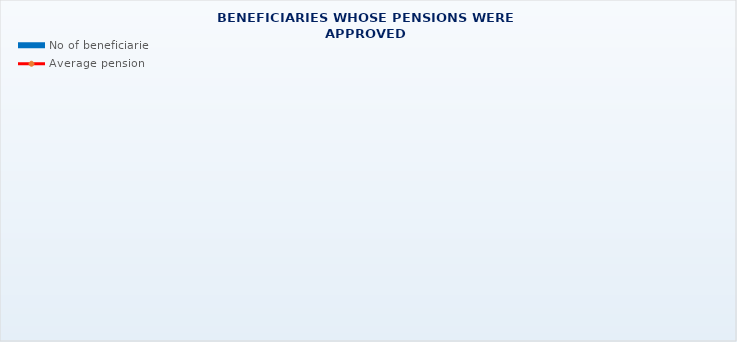
| Category | No of beneficiaries |
|---|---|
| Authorised officials in internal affairs, judicial officers and workers engaged in demining work: | 17264 |
| Pension beneficiaries entitled under the Fire Services Act (Official Gazette 125/19)* | 48 |
| Active military personnel - DVO  | 15819 |
| Croatian Homeland Army veterans mobilised from 1941 to 1945 | 3576 |
| Former political prisoners | 2687 |
| Croatian Veterans from the Homeland War - ZOHBDR (Act on Croatian Homeland War Veterans and Their Family Members) | 71127 |
| Pensions approved under general regulations and determined according to the Act on the Rights of Croatian Homeland War Veterans and their Family Members (ZOHBDR), in 2017 (Art. 27, 35, 48 and 49, paragraph 2)    | 45803 |
| Former Yugoslav People's Army members - JNA   | 5072 |
| Former Yugoslav People's Army members - JNA - Art. 185 of Pension Insurance Act (ZOMO)  | 151 |
| National Liberation War veterans - NOR | 8582 |
| Members of the Croatian Parliament, members of the Government, judges of the Constitutional Court and the Auditor General | 681 |
| Members of the Parliamentary Executive Council and administratively retired federal civil servants  (relates to the former SFRY) | 91 |
| Former officials of federal bodies o the former SFRJ -  Article 38 of the Pension Insurance Act (ZOMO) | 30 |
| Full members of the Croatian Academy of Sciences and Arts - HAZU | 136 |
| Miners from the Istrian coal mines "Tupljak" d.d. Labin  | 254 |
| Workers professionally exposed to asbestos | 861 |
| Insurees - crew members on a ship in international and national navigation  - Article  129, paragraph 2 of the Maritime Code | 183 |
| Members of the Croatian Defence Council - HVO  | 6750 |